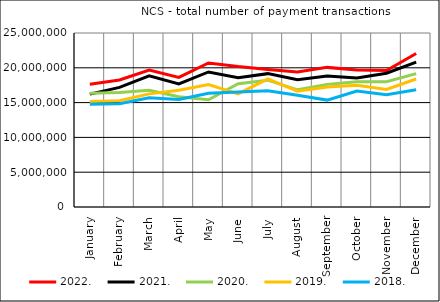
| Category | 2022. | 2021. | 2020. | 2019. | 2018. |
|---|---|---|---|---|---|
| January | 17650229 | 16221327 | 16346123 | 15174524 | 14757807 |
| February | 18258849 | 17192566 | 16445144 | 15276533 | 14822755 |
| March | 19663551 | 18832462 | 16758138 | 16252635 | 15687333 |
| April | 18619917 | 17679568 | 15853226 | 16786481 | 15445835 |
| May | 20696889 | 19402438 | 15413590 | 17596535 | 16338793 |
| June | 20175242 | 18571347 | 17701142 | 16249335 | 16523063 |
| July | 19758352 | 19160828 | 18222679 | 18397147 | 16700818 |
| August | 19409282 | 18281831 | 16837389 | 16637568 | 16046591 |
| September | 20059949 | 18829227 | 17618815 | 17224927 | 15358831 |
| October | 19685402 | 18525892 | 17987969 | 17508338 | 16658115 |
| November | 19619037 | 19221512 | 17991645 | 16897604 | 16131518 |
| December | 22050970 | 20820693 | 19158576 | 18390136 | 16837884 |